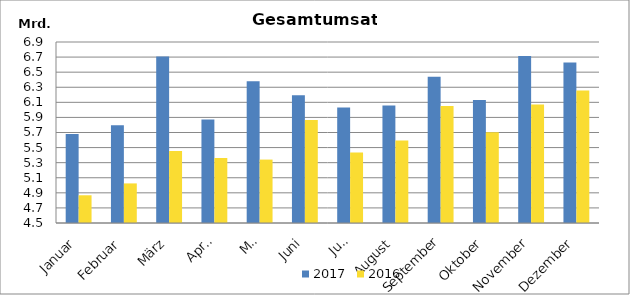
| Category | 2017 | 2016 |
|---|---|---|
| Januar | 5680068.151 | 4867726.356 |
| Februar | 5795107.501 | 5024966.847 |
| März | 6708333.235 | 5453364.687 |
| April | 5872561.635 | 5362250.935 |
| Mai | 6378201.631 | 5340830.243 |
| Juni | 6192779.155 | 5866358.862 |
| Juli | 6032517.811 | 5434695.074 |
| August | 6059007.897 | 5593489.883 |
| September | 6440686.11 | 6051741.198 |
| Oktober | 6131988.434 | 5702445.799 |
| November | 6715412.123 | 6071790.938 |
| Dezember | 6628251.25 | 6255419.165 |